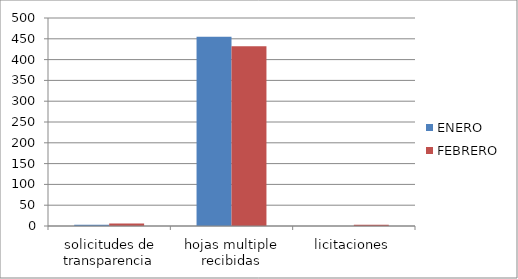
| Category | ENERO | FEBRERO |
|---|---|---|
| solicitudes de transparencia | 3 | 6 |
| hojas multiple recibidas | 455 | 432 |
| licitaciones | 0 | 3 |